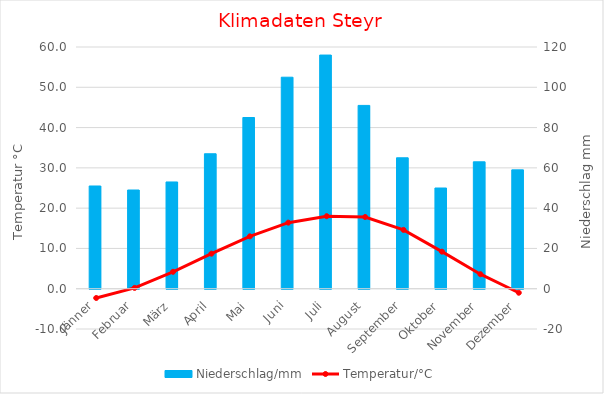
| Category | Niederschlag/mm |
|---|---|
| Jänner | 51 |
| Februar | 49 |
| März | 53 |
| April | 67 |
| Mai | 85 |
| Juni | 105 |
| Juli | 116 |
| August | 91 |
| September | 65 |
| Oktober | 50 |
| November | 63 |
| Dezember | 59 |